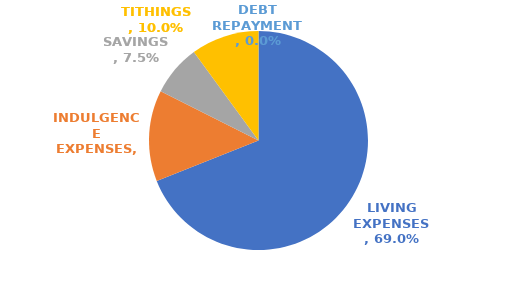
| Category | Series 0 |
|---|---|
| LIVING EXPENSES | 0.69 |
| INDULGENCE EXPENSES | 0.134 |
| SAVINGS | 0.075 |
| TITHINGS | 0.1 |
| DEBT REPAYMENT | 0 |